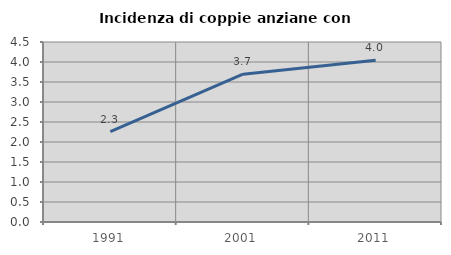
| Category | Incidenza di coppie anziane con figli |
|---|---|
| 1991.0 | 2.259 |
| 2001.0 | 3.694 |
| 2011.0 | 4.045 |